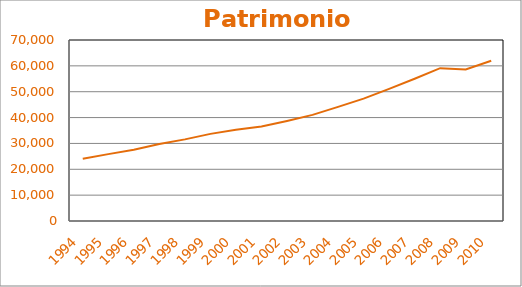
| Category | Patrimonio (n.) |
|---|---|
| 1994.0 | 24069 |
| 1995.0 | 25864 |
| 1996.0 | 27517 |
| 1997.0 | 29761 |
| 1998.0 | 31574 |
| 1999.0 | 33700 |
| 2000.0 | 35250 |
| 2001.0 | 36558 |
| 2002.0 | 38692 |
| 2003.0 | 41037 |
| 2004.0 | 44134 |
| 2005.0 | 47306 |
| 2006.0 | 51087 |
| 2007.0 | 55020 |
| 2008.0 | 59096 |
| 2009.0 | 58582 |
| 2010.0 | 61987 |